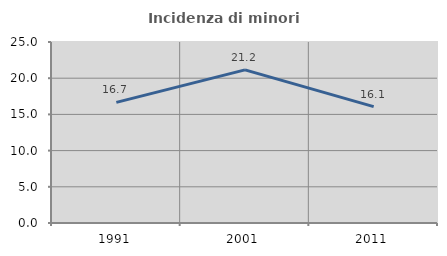
| Category | Incidenza di minori stranieri |
|---|---|
| 1991.0 | 16.667 |
| 2001.0 | 21.154 |
| 2011.0 | 16.071 |